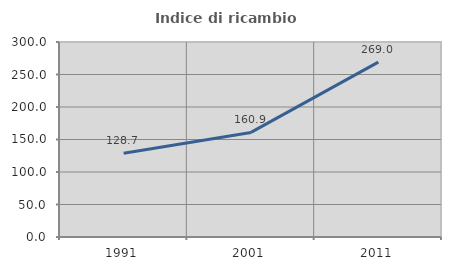
| Category | Indice di ricambio occupazionale  |
|---|---|
| 1991.0 | 128.713 |
| 2001.0 | 160.886 |
| 2011.0 | 269.014 |